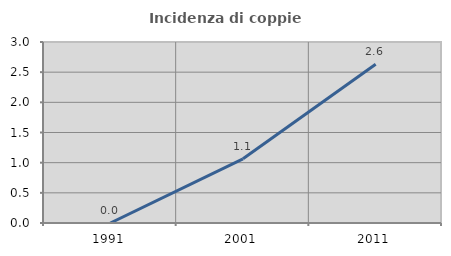
| Category | Incidenza di coppie miste |
|---|---|
| 1991.0 | 0 |
| 2001.0 | 1.064 |
| 2011.0 | 2.632 |